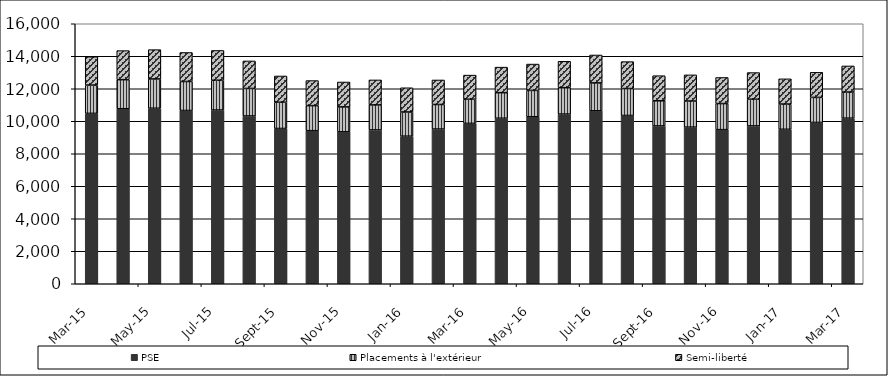
| Category | PSE | Placements à l'extérieur | Semi-liberté |
|---|---|---|---|
| 2015-03-01 | 10485 | 1742 | 1742 |
| 2015-04-01 | 10770 | 1789 | 1789 |
| 2015-05-01 | 10801 | 1803 | 1803 |
| 2015-06-01 | 10662 | 1785 | 1785 |
| 2015-07-01 | 10692 | 1832 | 1832 |
| 2015-08-01 | 10325 | 1694 | 1694 |
| 2015-09-01 | 9555 | 1616 | 1616 |
| 2015-10-01 | 9420 | 1542 | 1542 |
| 2015-11-01 | 9350 | 1533 | 1533 |
| 2015-12-01 | 9466 | 1539 | 1539 |
| 2016-01-01 | 9081 | 1490 | 1490 |
| 2016-02-01 | 9521 | 1510 | 1510 |
| 2016-03-01 | 9868 | 1486 | 1486 |
| 2016-04-01 | 10187 | 1572 | 1572 |
| 2016-05-01 | 10278 | 1621 | 1621 |
| 2016-06-01 | 10441 | 1625 | 1625 |
| 2016-07-01 | 10642 | 1718 | 1718 |
| 2016-08-01 | 10355 | 1658 | 1658 |
| 2016-09-01 | 9712 | 1546 | 1546 |
| 2016-10-01 | 9640 | 1607 | 1607 |
| 2016-11-01 | 9484 | 1605 | 1605 |
| 2016-12-01 | 9714 | 1641 | 1641 |
| 2017-01-01 | 9505 | 1553 | 1553 |
| 2017-02-01 | 9927 | 1542 | 1542 |
| 2017-03-01 | 10190 | 1607 | 1607 |